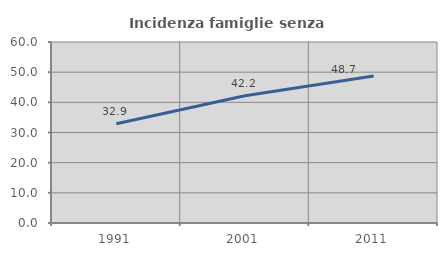
| Category | Incidenza famiglie senza nuclei |
|---|---|
| 1991.0 | 32.911 |
| 2001.0 | 42.195 |
| 2011.0 | 48.702 |